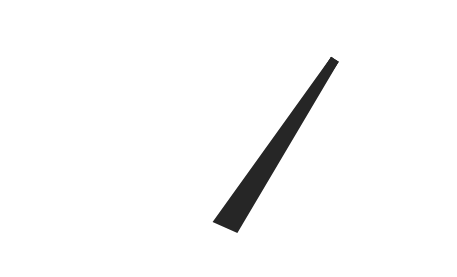
| Category | y |
|---|---|
| 73.60264053627934 | 44.079 |
| 51.763140543332916 | -0.944 |
| 48.236859456667084 | 0.944 |
| 73.60264053627934 | 44.079 |
| 50.0 | 0 |